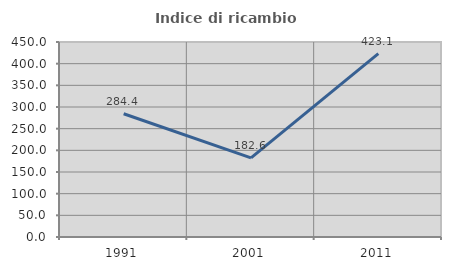
| Category | Indice di ricambio occupazionale  |
|---|---|
| 1991.0 | 284.444 |
| 2001.0 | 182.609 |
| 2011.0 | 423.077 |